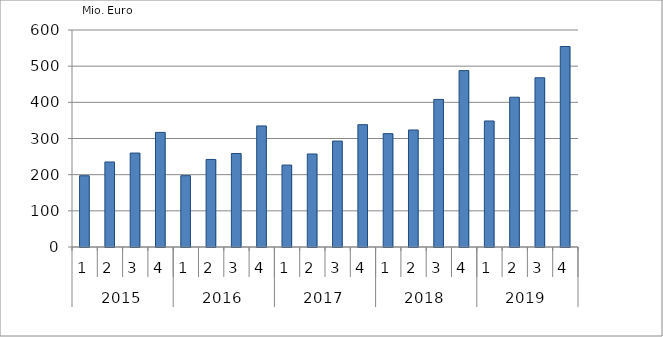
| Category | Ausbaugewerblicher Umsatz3 |
|---|---|
| 0 | 197030.42 |
| 1 | 235094.994 |
| 2 | 259758.438 |
| 3 | 316833.232 |
| 4 | 197219.532 |
| 5 | 242069.899 |
| 6 | 258547.84 |
| 7 | 334764.305 |
| 8 | 226552.317 |
| 9 | 257191.13 |
| 10 | 292853.372 |
| 11 | 338154.691 |
| 12 | 313433.569 |
| 13 | 323547.694 |
| 14 | 408057.42 |
| 15 | 487843.765 |
| 16 | 348466.115 |
| 17 | 414145.554 |
| 18 | 467849.207 |
| 19 | 554369.34 |